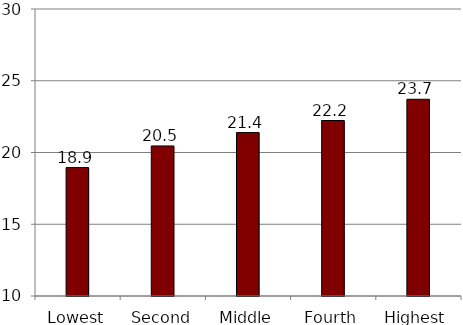
| Category | Series 0 |
|---|---|
| Lowest | 18.948 |
| Second | 20.457 |
| Middle | 21.387 |
| Fourth | 22.23 |
| Highest | 23.709 |